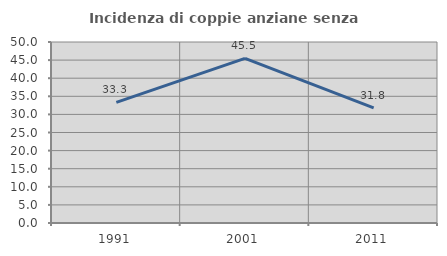
| Category | Incidenza di coppie anziane senza figli  |
|---|---|
| 1991.0 | 33.333 |
| 2001.0 | 45.455 |
| 2011.0 | 31.818 |